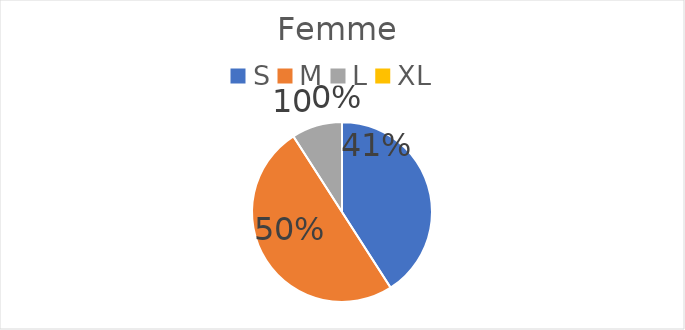
| Category | Series 0 |
|---|---|
| S | 9 |
| M | 11 |
| L | 2 |
| XL | 0 |